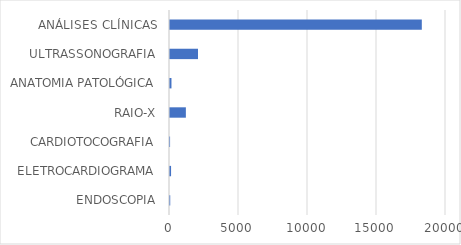
| Category | Series 0 |
|---|---|
| ENDOSCOPIA | 17 |
| ELETROCARDIOGRAMA | 77 |
| CARDIOTOCOGRAFIA | 5 |
| RAIO-X | 1150 |
| ANATOMIA PATOLÓGICA | 106 |
| ULTRASSONOGRAFIA | 2030 |
| ANÁLISES CLÍNICAS | 18247 |